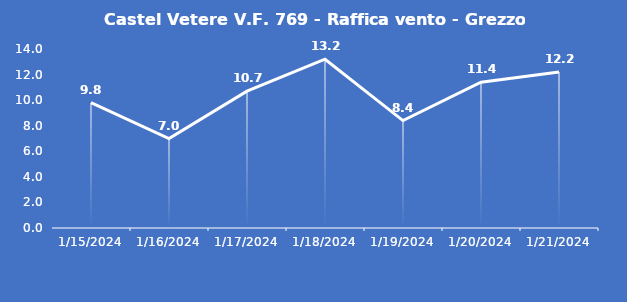
| Category | Castel Vetere V.F. 769 - Raffica vento - Grezzo (m/s) |
|---|---|
| 1/15/24 | 9.8 |
| 1/16/24 | 7 |
| 1/17/24 | 10.7 |
| 1/18/24 | 13.2 |
| 1/19/24 | 8.4 |
| 1/20/24 | 11.4 |
| 1/21/24 | 12.2 |